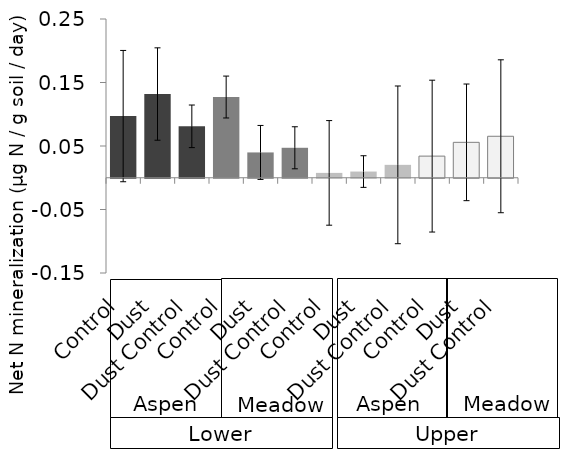
| Category | Series 0 |
|---|---|
| Control | 0.097 |
| Dust | 0.132 |
| Dust Control | 0.081 |
| Control | 0.127 |
| Dust | 0.04 |
| Dust Control | 0.047 |
| Control | 0.008 |
| Dust | 0.01 |
| Dust Control | 0.02 |
| Control | 0.034 |
| Dust | 0.056 |
| Dust Control | 0.065 |